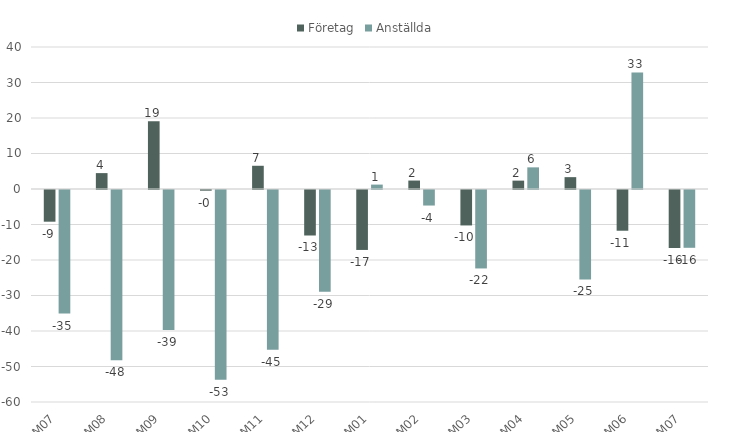
| Category | Företag | Anställda |
|---|---|---|
| 2021M07 | -8.929 | -34.794 |
| 2021M08 | 4.478 | -47.957 |
| 2021M09 | 19.095 | -39.444 |
| 2021M10 | -0.195 | -53.465 |
| 2021M11 | 6.542 | -45.011 |
| 2021M12 | -12.817 | -28.632 |
| 2022M01 | -16.886 | 1.242 |
| 2022M02 | 2.381 | -4.375 |
| 2022M03 | -9.984 | -22.096 |
| 2022M04 | 2.361 | 6.096 |
| 2022M05 | 3.339 | -25.203 |
| 2022M06 | -11.473 | 32.845 |
| 2022M07 | -16.34 | -16.279 |